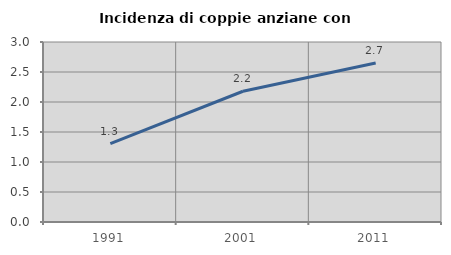
| Category | Incidenza di coppie anziane con figli |
|---|---|
| 1991.0 | 1.306 |
| 2001.0 | 2.179 |
| 2011.0 | 2.651 |